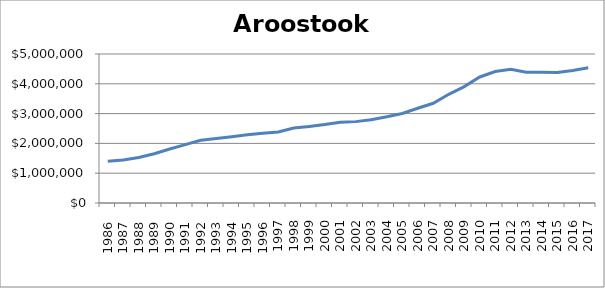
| Category | Aroostook |
|---|---|
|       1986 | 1403850 |
|       1987 | 1443500 |
|       1988 | 1527200 |
|       1989 | 1653100 |
|       1990 | 1812300 |
|       1991 | 1958900 |
|       1992 | 2105650 |
|       1993 | 2164164.66 |
|       1994 | 2221800 |
|       1995 | 2287100 |
|       1996 | 2337700 |
| 1997 | 2385650 |
| 1998 | 2515400 |
| 1999 | 2569150 |
| 2000 | 2630800 |
| 2001 | 2706850 |
| 2002 | 2730750 |
| 2003 | 2796750 |
| 2004 | 2891300 |
| 2005 | 3002900 |
| 2006 | 3180250 |
| 2007 | 3347150 |
| 2008 | 3647350 |
| 2009 | 3907050 |
| 2010 | 4228950 |
| 2011 | 4410050 |
| 2012 | 4484550 |
| 2013 | 4385550 |
| 2014 | 4388250 |
| 2015 | 4375750 |
| 2016 | 4443050 |
| 2017 | 4535900 |